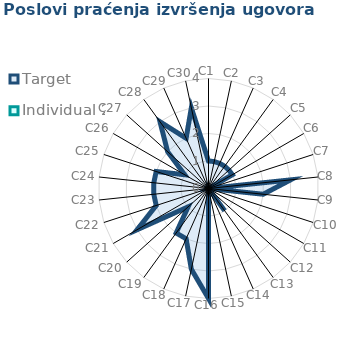
| Category | Target | Individual 2 |
|---|---|---|
| C1 | 1 | 0 |
| C2 | 1 | 0 |
| C3 | 1 | 0 |
| C4 | 1 | 0 |
| C5 | 1 | 0 |
| C6 | 1 | 0 |
| C7 | 0 | 0 |
| C8 | 3 | 0 |
| C9 | 2 | 0 |
| C10 | 0 | 0 |
| C11 | 0 | 0 |
| C12 | 0 | 0 |
| C13 | 1 | 0 |
| C14 | 0 | 0 |
| C15 | 0 | 0 |
| C16 | 4 | 0 |
| C17 | 3 | 0 |
| C18 | 2 | 0 |
| C19 | 2 | 0 |
| C20 | 1 | 0 |
| C21 | 3 | 0 |
| C22 | 2 | 0 |
| C23 | 2 | 0 |
| C24 | 2 | 0 |
| C25 | 2 | 0 |
| C26 | 1 | 0 |
| C27 | 2 | 0 |
| C28 | 3 | 0 |
| C29 | 2 | 0 |
| C30 | 3 | 0 |